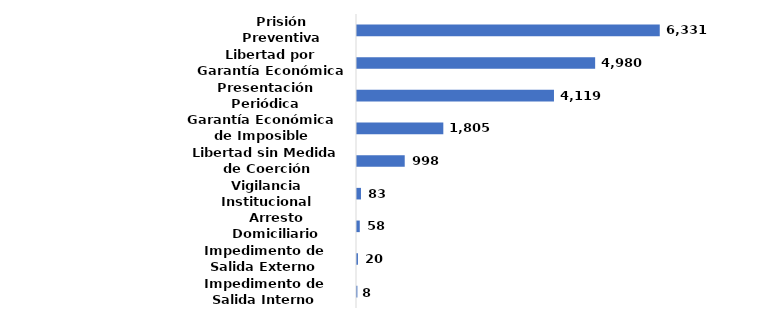
| Category | Series 0 |
|---|---|
| Impedimento de Salida Interno | 0 |
| Impedimento de Salida Externo | 0.001 |
| Arresto Domiciliario | 0.003 |
| Vigilancia Institucional | 0.005 |
| Libertad sin Medida de Coerción | 0.054 |
| Garantía Económica de Imposible Cumplimiento | 0.098 |
| Presentación Periódica | 0.224 |
| Libertad por Garantía Económica | 0.271 |
| Prisión Preventiva | 0.344 |